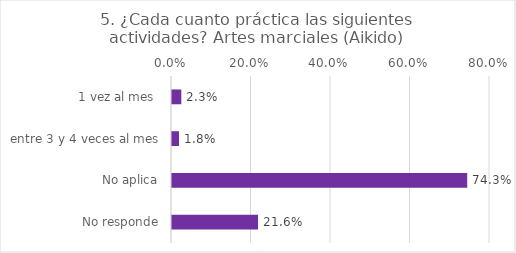
| Category | Series 0 |
|---|---|
| 1 vez al mes  | 0.023 |
| entre 3 y 4 veces al mes | 0.018 |
| No aplica | 0.743 |
| No responde | 0.216 |